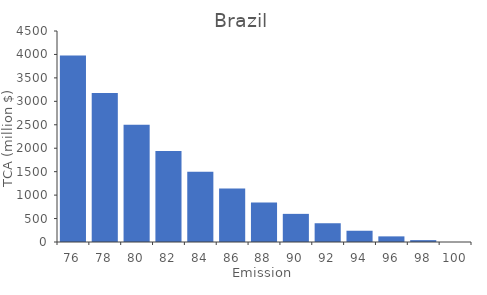
| Category | TCA (million $) |
|---|---|
| 76.0 | 3980 |
| 78.0 | 3180 |
| 80.0 | 2500 |
| 82.0 | 1940 |
| 84.0 | 1500 |
| 86.0 | 1140 |
| 88.0 | 840 |
| 90.0 | 600 |
| 92.0 | 400 |
| 94.0 | 240 |
| 96.0 | 120 |
| 98.0 | 40 |
| 100.0 | 0 |